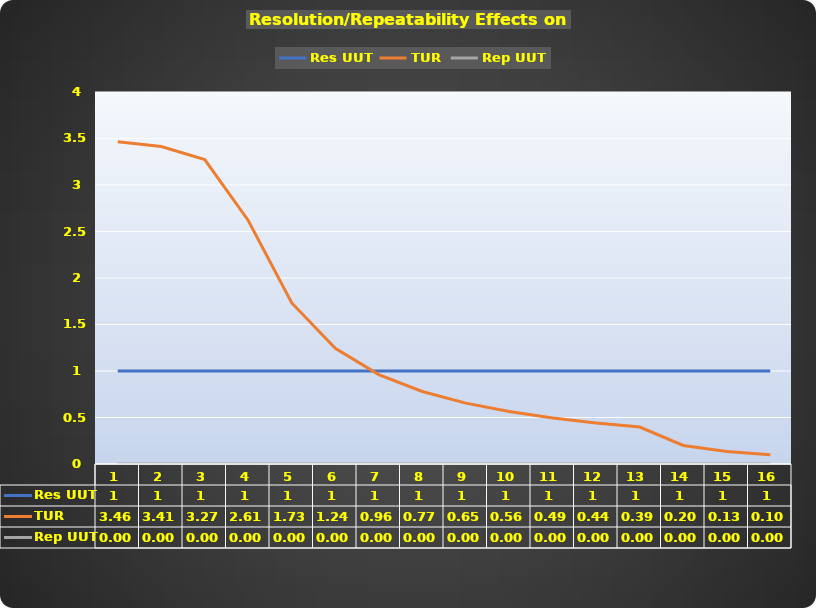
| Category | Res UUT | TUR | Rep UUT |
|---|---|---|---|
| 0 | 1 | 3.464 | 0 |
| 1 | 1 | 3.413 | 0 |
| 2 | 1 | 3.273 | 0 |
| 3 | 1 | 2.619 | 0 |
| 4 | 1 | 1.732 | 0 |
| 5 | 1 | 1.244 | 0 |
| 6 | 1 | 0.961 | 0 |
| 7 | 1 | 0.779 | 0 |
| 8 | 1 | 0.655 | 0 |
| 9 | 1 | 0.564 | 0 |
| 10 | 1 | 0.495 | 0 |
| 11 | 1 | 0.441 | 0 |
| 12 | 1 | 0.397 | 0 |
| 13 | 1 | 0.2 | 0 |
| 14 | 1 | 0.133 | 0 |
| 15 | 1 | 0.1 | 0 |